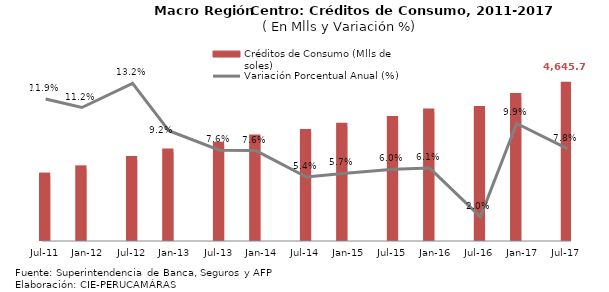
| Category | Créditos de Consumo (Mlls de soles) |
|---|---|
| 2011-07-01 | 1929.511 |
| 2011-12-01 | 2145.414 |
| 2012-07-01 | 2428.769 |
| 2012-12-01 | 2653.232 |
| 2013-07-01 | 2855.046 |
| 2013-12-01 | 3071.481 |
| 2014-07-01 | 3236.296 |
| 2014-12-01 | 3419.553 |
| 2015-07-01 | 3625.159 |
| 2015-12-01 | 3846.831 |
| 2016-07-01 | 3924.843 |
| 2016-12-01 | 4311.539 |
| 2017-07-01 | 4645.707 |